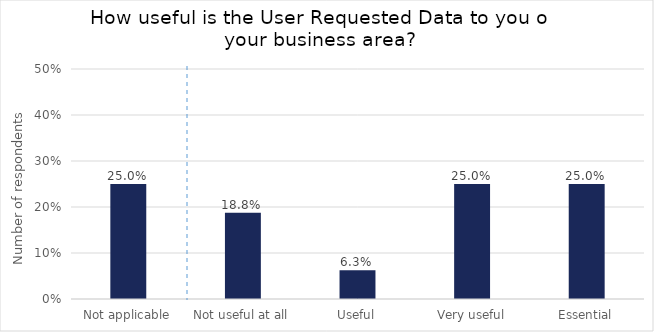
| Category | How useful is the User Requested Data to you or your business area? |
|---|---|
| Not applicable | 0.25 |
| Not useful at all | 0.188 |
| Useful | 0.062 |
| Very useful | 0.25 |
| Essential | 0.25 |